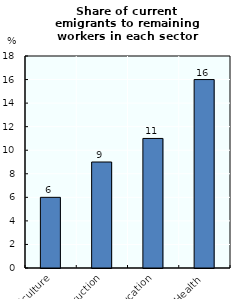
| Category | Series 0 |
|---|---|
| Agriculture | 6 |
| Construction | 9 |
| Education | 11 |
| Health | 16 |